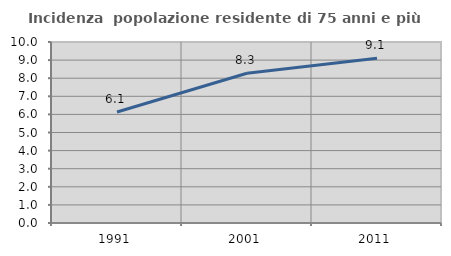
| Category | Incidenza  popolazione residente di 75 anni e più |
|---|---|
| 1991.0 | 6.13 |
| 2001.0 | 8.273 |
| 2011.0 | 9.101 |